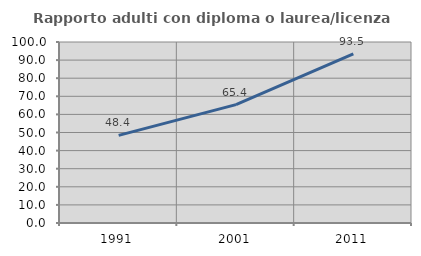
| Category | Rapporto adulti con diploma o laurea/licenza media  |
|---|---|
| 1991.0 | 48.41 |
| 2001.0 | 65.399 |
| 2011.0 | 93.484 |